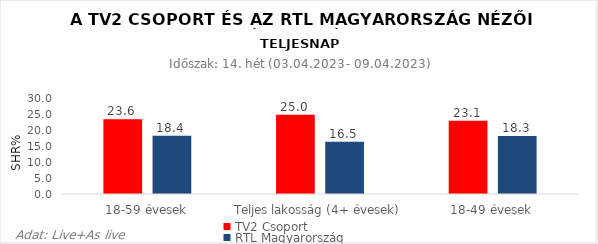
| Category | TV2 Csoport | RTL Magyarország |
|---|---|---|
| 18-59 évesek | 23.6 | 18.4 |
| Teljes lakosság (4+ évesek) | 25 | 16.5 |
| 18-49 évesek | 23.1 | 18.3 |